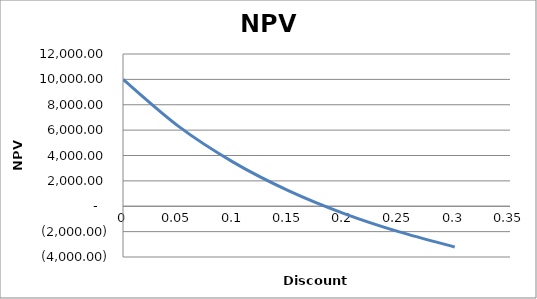
| Category | Series 0 |
|---|---|
| 0.0 | 10000 |
| 0.05 | 6313.679 |
| 0.1 | 3459.428 |
| 0.15 | 1214.41 |
| 0.2 | -576.818 |
| 0.25 | -2024.704 |
| 0.3 | -3209.066 |